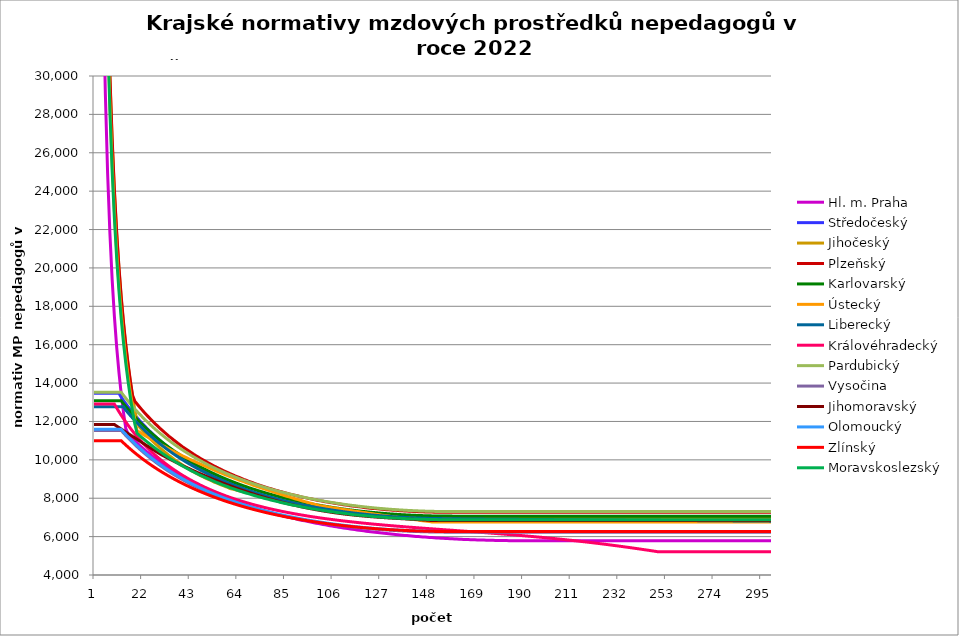
| Category | Hl. m. Praha | Středočeský | Jihočeský | Plzeňský | Karlovarský  | Ústecký   | Liberecký | Královéhradecký | Pardubický | Vysočina | Jihomoravský | Olomoucký | Zlínský | Moravskoslezský |
|---|---|---|---|---|---|---|---|---|---|---|---|---|---|---|
| 0 | 174132.515 | 13474.444 | 239423.04 | 240610 | 13079.309 | 216556.8 | 12770.985 | 12903.738 | 13519.044 | 11532.848 | 11842.105 | 11593.122 | 10994.974 | 225600 |
| 1 | 87334.154 | 13474.444 | 119711.52 | 120305 | 13079.309 | 111809.2 | 12770.985 | 12903.738 | 13519.044 | 11532.848 | 11842.105 | 11593.122 | 10994.974 | 112800 |
| 2 | 58163.115 | 13474.444 | 79807.68 | 80203.333 | 13079.309 | 75358.578 | 12770.985 | 12903.738 | 13519.044 | 11532.848 | 11842.105 | 11593.122 | 10994.974 | 75200 |
| 3 | 43667.077 | 13474.444 | 59855.76 | 60152.5 | 13079.309 | 56831.191 | 12770.985 | 12903.738 | 13519.044 | 11532.848 | 11842.105 | 11593.122 | 10994.974 | 56400 |
| 4 | 34912.177 | 13474.444 | 47884.608 | 48122 | 13079.309 | 45616.166 | 12770.985 | 12903.738 | 13519.044 | 11532.848 | 11842.105 | 11593.122 | 10994.974 | 45120 |
| 5 | 29111.385 | 13474.444 | 39903.84 | 40101.667 | 13079.309 | 38097.946 | 12770.985 | 12903.738 | 13519.044 | 11532.848 | 11842.105 | 11593.122 | 10994.974 | 37600 |
| 6 | 24941.652 | 13474.444 | 34203.291 | 34372.857 | 13079.309 | 32707.298 | 12770.985 | 12903.738 | 13519.044 | 11532.848 | 11842.105 | 11593.122 | 10994.974 | 32228.571 |
| 7 | 21833.538 | 13474.444 | 29927.88 | 30076.25 | 13079.309 | 28653.051 | 12770.985 | 12903.738 | 13519.044 | 11532.848 | 11842.105 | 11593.122 | 10994.974 | 28200 |
| 8 | 19400.957 | 13474.444 | 26602.56 | 26734.444 | 13079.309 | 25493.049 | 12770.985 | 12903.738 | 13519.044 | 11532.848 | 11842.105 | 11593.122 | 10994.974 | 25066.667 |
| 9 | 17466.831 | 13474.444 | 23942.304 | 24061 | 13079.309 | 22960.815 | 12770.985 | 12903.738 | 13519.044 | 11532.848 | 11842.105 | 11593.122 | 10994.974 | 22560 |
| 10 | 15874.497 | 13474.444 | 21765.731 | 21873.636 | 13079.309 | 20886.183 | 12770.985 | 12704.407 | 13519.044 | 11532.848 | 11757.269 | 11593.122 | 10994.974 | 20509.091 |
| 11 | 14555.692 | 13474.444 | 19951.92 | 20050.833 | 13079.309 | 19155.391 | 12770.985 | 12511.141 | 13519.044 | 11532.848 | 11683.417 | 11593.122 | 10994.974 | 18800 |
| 12 | 13432.844 | 13259.201 | 18417.157 | 18508.462 | 13079.425 | 17689.501 | 12770.985 | 12323.667 | 13519.044 | 11532.848 | 11605.657 | 11593.122 | 10994.974 | 17353.846 |
| 13 | 12476.308 | 13092.983 | 17101.646 | 17186.429 | 12929.335 | 16432.021 | 12770.985 | 12147.003 | 13364.028 | 11400.57 | 11528.926 | 11456.732 | 10882.85 | 16114.286 |
| 14 | 11642.166 | 12931.988 | 15961.536 | 16040.667 | 12783.648 | 15341.454 | 12591.093 | 11975.332 | 13213.443 | 11272.173 | 11453.202 | 11328.393 | 10773.736 | 15040 |
| 15 | 11357.983 | 12775.987 | 14963.94 | 15038.125 | 12642.182 | 14386.636 | 12450.554 | 11808.446 | 13067.22 | 11147.498 | 11373.828 | 11202.897 | 10667.521 | 14100 |
| 16 | 11232.133 | 12624.76 | 14083.708 | 14153.529 | 12504.766 | 13543.706 | 12314.064 | 11651 | 12925.184 | 11026.394 | 11300.122 | 11080.152 | 10564.099 | 13270.588 |
| 17 | 11113.391 | 12478.103 | 13301.28 | 13367.222 | 12371.238 | 12794.086 | 12181.461 | 11497.697 | 12787.167 | 10908.307 | 11222.848 | 10964.637 | 10463.367 | 12533.333 |
| 18 | 10997.133 | 12335.822 | 12601.213 | 13058.887 | 12241.445 | 12123.094 | 12052.591 | 11352.984 | 12653.011 | 10793.934 | 11146.624 | 10847.03 | 10365.23 | 11873.684 |
| 19 | 10883.282 | 12197.735 | 11971.152 | 12912.88 | 12115.243 | 11518.975 | 11927.307 | 11211.868 | 12522.565 | 10682.726 | 11067.037 | 10736.301 | 10269.595 | 11386.578 |
| 20 | 10771.765 | 12063.67 | 11724.949 | 12770.102 | 11992.493 | 11445.92 | 11805.471 | 11074.218 | 12395.688 | 10574.563 | 10992.908 | 10627.809 | 10176.376 | 11280.023 |
| 21 | 10666.516 | 11933.463 | 11586.18 | 12630.446 | 11873.064 | 11373.782 | 11686.952 | 10944.188 | 12272.245 | 10469.328 | 10915.493 | 10521.489 | 10085.489 | 11176.195 |
| 22 | 10563.305 | 11806.961 | 11452.134 | 12493.812 | 11756.834 | 11302.547 | 11571.625 | 10817.176 | 12152.107 | 10366.54 | 10839.161 | 10421.403 | 9996.854 | 11075.002 |
| 23 | 10458.217 | 11684.017 | 11322.598 | 12365.396 | 11643.684 | 11232.199 | 11459.372 | 10697.169 | 12035.153 | 10266.847 | 10763.889 | 10319.152 | 9910.395 | 10976.35 |
| 24 | 10358.978 | 11564.493 | 11197.371 | 12239.593 | 11533.503 | 11162.722 | 11350.08 | 10575.794 | 11921.267 | 10169.771 | 10689.655 | 10222.862 | 9826.041 | 10880.154 |
| 25 | 10261.605 | 11448.258 | 11076.266 | 12116.324 | 11426.183 | 11094.098 | 11243.643 | 10464.97 | 11810.338 | 10075.218 | 10616.438 | 10128.351 | 9743.722 | 10786.331 |
| 26 | 10169.688 | 11335.187 | 10959.105 | 11995.513 | 11321.623 | 11026.314 | 11139.959 | 10352.61 | 11702.264 | 9982.753 | 10540.234 | 10035.573 | 9663.372 | 10694.802 |
| 27 | 10075.825 | 11225.163 | 10845.721 | 11877.088 | 11219.727 | 10959.352 | 11038.93 | 10246.391 | 11596.942 | 9893.328 | 10465.116 | 9944.478 | 9584.927 | 10605.491 |
| 28 | 9983.679 | 11118.074 | 10735.957 | 11765.77 | 11120.403 | 10893.199 | 10940.465 | 10142.329 | 11494.279 | 9805.49 | 10391.061 | 9855.022 | 9508.328 | 10518.326 |
| 29 | 9896.653 | 11013.812 | 10629.666 | 11651.816 | 11023.563 | 10827.84 | 10844.475 | 10043.966 | 11394.183 | 9720.182 | 10314.233 | 9770.792 | 9433.517 | 10433.238 |
| 30 | 9811.13 | 10912.276 | 10526.706 | 11544.662 | 10929.124 | 10763.26 | 10750.876 | 9947.492 | 11296.568 | 9636.99 | 10249.816 | 9684.42 | 9360.437 | 10350.162 |
| 31 | 9727.073 | 10813.371 | 10426.946 | 11439.461 | 10837.004 | 10699.447 | 10659.589 | 9852.854 | 11201.352 | 9555.843 | 10186.199 | 9603.068 | 9289.037 | 10269.034 |
| 32 | 9644.444 | 10717.002 | 10330.261 | 11340.613 | 10747.129 | 10636.385 | 10570.537 | 9763.408 | 11108.455 | 9476.363 | 10123.367 | 9523.071 | 9219.264 | 10189.794 |
| 33 | 9566.431 | 10623.085 | 10236.533 | 11239.081 | 10659.426 | 10574.062 | 10483.647 | 9675.571 | 11017.803 | 9399.113 | 10061.305 | 9447.79 | 9151.071 | 10112.384 |
| 34 | 9486.497 | 10531.533 | 10145.649 | 11143.651 | 10573.823 | 10512.466 | 10398.849 | 9589.3 | 10929.322 | 9323.716 | 10000 | 9370.349 | 9084.411 | 10036.748 |
| 35 | 9411.008 | 10442.269 | 10057.504 | 11045.601 | 10490.256 | 10451.583 | 10316.076 | 9507.786 | 10842.945 | 9250.112 | 9939.437 | 9297.454 | 9019.238 | 9962.834 |
| 36 | 9333.64 | 10355.216 | 9971.998 | 10953.414 | 10408.66 | 10391.401 | 10235.265 | 9427.647 | 10758.606 | 9177.954 | 9879.603 | 9225.684 | 8955.511 | 9890.59 |
| 37 | 9260.555 | 10270.301 | 9889.034 | 10862.754 | 10328.974 | 10331.908 | 10156.354 | 9348.847 | 10676.241 | 9107.776 | 9820.486 | 9155.014 | 8893.186 | 9819.967 |
| 38 | 9191.58 | 10187.455 | 9808.523 | 10777.604 | 10251.139 | 10273.093 | 10079.285 | 9271.353 | 10595.789 | 9038.946 | 9762.071 | 9085.418 | 8832.226 | 9750.919 |
| 39 | 9120.694 | 10106.611 | 9730.379 | 10689.819 | 10175.1 | 10214.943 | 10004.002 | 9198.158 | 10517.194 | 8971.987 | 9704.348 | 9016.872 | 8772.59 | 9683.401 |
| 40 | 9050.893 | 10027.707 | 9654.52 | 10607.348 | 10100.803 | 10157.448 | 9930.45 | 9129.089 | 10440.398 | 8906.563 | 9647.303 | 8952.4 | 8714.244 | 9617.369 |
| 41 | 8984.995 | 9950.681 | 9580.868 | 10526.139 | 10028.196 | 10100.597 | 9858.58 | 9058.115 | 10365.35 | 8842.357 | 9590.925 | 8888.844 | 8657.151 | 9552.781 |
| 42 | 8920.05 | 9875.476 | 9509.349 | 10446.165 | 9957.23 | 10044.378 | 9788.34 | 8991.125 | 10291.998 | 8779.873 | 9538.462 | 8823.221 | 8601.277 | 9489.598 |
| 43 | 8853.275 | 9802.036 | 9439.894 | 10367.397 | 9887.857 | 9988.782 | 9719.684 | 8925.12 | 10220.294 | 8718.793 | 9483.345 | 8764.4 | 8546.591 | 9427.781 |
| 44 | 8790.214 | 9730.307 | 9372.436 | 10289.808 | 9820.033 | 9933.798 | 9652.567 | 8862.884 | 10150.189 | 8658.816 | 9428.861 | 8703.476 | 8493.059 | 9367.293 |
| 45 | 8730.729 | 9660.239 | 9306.91 | 10216.985 | 9753.712 | 9879.416 | 9586.944 | 8801.511 | 10081.638 | 8600.686 | 9375 | 8643.393 | 8440.653 | 9308.098 |
| 46 | 8669.395 | 9591.782 | 9243.257 | 10145.186 | 9688.854 | 9825.626 | 9522.773 | 8740.982 | 10014.6 | 8543.331 | 9321.751 | 8586.937 | 8389.342 | 9250.163 |
| 47 | 8611.529 | 9524.889 | 9181.418 | 10074.389 | 9625.417 | 9772.419 | 9460.015 | 8681.279 | 9949.03 | 8487.236 | 9269.103 | 8531.213 | 8339.1 | 9193.454 |
| 48 | 8551.853 | 9459.517 | 9121.337 | 10004.574 | 9563.364 | 9719.785 | 9398.63 | 8625.046 | 9884.89 | 8432.613 | 9220.093 | 8476.209 | 8289.897 | 9137.939 |
| 49 | 8495.54 | 9395.62 | 9062.963 | 9935.719 | 9502.656 | 9667.714 | 9338.581 | 8569.537 | 9822.141 | 8379.175 | 9168.584 | 8421.909 | 8241.71 | 9083.588 |
| 50 | 8439.964 | 9333.158 | 9006.244 | 9867.806 | 9443.257 | 9616.199 | 9279.832 | 8514.738 | 9760.746 | 8326.651 | 9117.647 | 8368.3 | 8194.511 | 9030.372 |
| 51 | 8385.111 | 9272.09 | 8951.134 | 9804.143 | 9385.134 | 9565.23 | 9222.349 | 8463.196 | 9700.668 | 8275.494 | 9067.273 | 8318.001 | 8148.278 | 8978.261 |
| 52 | 8330.966 | 9212.379 | 8897.585 | 9741.296 | 9328.252 | 9514.798 | 9166.098 | 8412.274 | 9641.874 | 8225.196 | 9020.369 | 8268.302 | 8102.986 | 8927.229 |
| 53 | 8279.93 | 9153.987 | 8845.555 | 9679.249 | 9272.58 | 9464.895 | 9111.048 | 8361.962 | 9584.33 | 8175.97 | 8971.061 | 8219.193 | 8058.612 | 8877.248 |
| 54 | 8227.13 | 9096.878 | 8795 | 9617.988 | 9218.086 | 9415.513 | 9057.167 | 8312.247 | 9528.005 | 8128.246 | 8922.29 | 8170.665 | 8015.136 | 8828.294 |
| 55 | 8177.355 | 9041.02 | 8745.882 | 9560.662 | 9164.742 | 9366.644 | 9004.427 | 8265.563 | 9472.867 | 8081.303 | 8876.869 | 8122.706 | 7972.535 | 8780.342 |
| 56 | 8128.179 | 8986.378 | 8698.161 | 9500.888 | 9112.517 | 9318.279 | 8952.797 | 8219.4 | 9418.886 | 8035.123 | 8829.114 | 8075.307 | 7930.79 | 8733.368 |
| 57 | 8079.59 | 8932.922 | 8651.801 | 9444.946 | 9061.385 | 9270.411 | 8902.251 | 8173.75 | 9366.035 | 7989.91 | 8781.87 | 8030.91 | 7889.88 | 8687.348 |
| 58 | 8031.579 | 8880.62 | 8606.767 | 9389.659 | 9011.319 | 9223.032 | 8852.762 | 8128.605 | 9314.286 | 7945.642 | 8737.864 | 7986.999 | 7849.787 | 8642.261 |
| 59 | 7986.382 | 8829.444 | 8563.026 | 9335.015 | 8962.293 | 9176.136 | 8804.304 | 8086.293 | 9263.611 | 7902.511 | 8691.589 | 7943.565 | 7810.492 | 8598.085 |
| 60 | 7939.469 | 8779.365 | 8508.044 | 9281.003 | 8914.282 | 9129.713 | 8756.852 | 8044.419 | 9213.986 | 7860.275 | 8648.481 | 7900.601 | 7771.978 | 8554.8 |
| 61 | 7895.299 | 8730.356 | 8476.848 | 9230.563 | 8867.261 | 9083.758 | 8710.383 | 8005.268 | 9165.385 | 7818.7 | 8603.145 | 7858.099 | 7734.226 | 8512.385 |
| 62 | 7851.618 | 8682.39 | 8446.115 | 9177.75 | 8821.209 | 9038.264 | 8664.874 | 7964.227 | 9117.784 | 7778.192 | 8560.908 | 7818.376 | 7697.221 | 8470.821 |
| 63 | 7808.418 | 8635.443 | 8415.838 | 9128.422 | 8776.102 | 8993.223 | 8620.301 | 7925.85 | 9071.161 | 7738.309 | 8516.484 | 7779.053 | 7660.946 | 8430.09 |
| 64 | 7765.691 | 8589.49 | 8386.009 | 9079.623 | 8731.919 | 8948.628 | 8576.645 | 7887.842 | 9025.492 | 7699.45 | 8475.091 | 7737.846 | 7625.385 | 8390.173 |
| 65 | 7723.429 | 8544.506 | 8356.62 | 9031.342 | 8688.639 | 8904.474 | 8533.882 | 7850.197 | 8980.757 | 7661.386 | 8434.099 | 7699.327 | 7590.524 | 8351.052 |
| 66 | 7683.703 | 8500.471 | 8327.666 | 8983.572 | 8646.242 | 8860.753 | 8491.995 | 7815.092 | 8936.935 | 7624.101 | 8393.502 | 7663.422 | 7556.348 | 8312.711 |
| 67 | 7642.326 | 8457.36 | 8299.138 | 8939.071 | 8604.708 | 8817.459 | 8450.963 | 7780.301 | 8894.004 | 7587.176 | 8353.293 | 7625.638 | 7522.843 | 8275.134 |
| 68 | 7603.429 | 8415.154 | 8271.031 | 8895.009 | 8564.018 | 8774.587 | 8410.767 | 7745.817 | 8851.946 | 7551.399 | 8313.468 | 7590.416 | 7489.995 | 8238.303 |
| 69 | 7564.925 | 8373.832 | 8243.338 | 8851.38 | 8524.155 | 8732.129 | 8371.389 | 7711.638 | 8810.742 | 7516.349 | 8274.021 | 7555.517 | 7457.79 | 8202.205 |
| 70 | 7526.81 | 8333.373 | 8216.052 | 8808.176 | 8485.099 | 8690.08 | 8332.812 | 7677.759 | 8770.374 | 7481.818 | 8234.947 | 7520.938 | 7426.216 | 8166.823 |
| 71 | 7491.053 | 8293.76 | 8189.167 | 8765.392 | 8446.835 | 8648.435 | 8295.018 | 7646.267 | 8730.823 | 7448.18 | 8196.24 | 7486.674 | 7395.26 | 8132.144 |
| 72 | 7453.676 | 8254.973 | 8162.677 | 8723.021 | 8409.346 | 8607.186 | 8257.992 | 7615.033 | 8692.074 | 7414.842 | 8160.281 | 7452.721 | 7364.911 | 8098.154 |
| 73 | 7418.61 | 8216.994 | 8136.576 | 8683.669 | 8372.615 | 8566.329 | 8221.717 | 7584.052 | 8654.108 | 7382.559 | 8122.271 | 7421.169 | 7335.156 | 8064.839 |
| 74 | 7381.951 | 8179.807 | 8110.858 | 8644.671 | 8336.628 | 8525.858 | 8186.177 | 7555.363 | 8616.911 | 7350.93 | 8086.957 | 7387.806 | 7305.984 | 8032.186 |
| 75 | 7347.554 | 8143.393 | 8085.518 | 8606.021 | 8301.369 | 8485.768 | 8151.358 | 7524.865 | 8580.466 | 7319.942 | 8051.948 | 7356.799 | 7277.384 | 8000.182 |
| 76 | 7313.476 | 8107.739 | 8060.55 | 8567.715 | 8266.823 | 8446.053 | 8117.246 | 7496.622 | 8544.76 | 7289.399 | 8014.938 | 7326.052 | 7249.345 | 7968.814 |
| 77 | 7279.713 | 8072.827 | 8035.948 | 8529.749 | 8232.978 | 8406.708 | 8083.826 | 7468.59 | 8509.776 | 7259.476 | 7980.549 | 7295.56 | 7221.858 | 7938.072 |
| 78 | 7248.11 | 8038.642 | 8011.708 | 8494.616 | 8199.818 | 8367.728 | 8051.085 | 7440.766 | 8475.501 | 7230.341 | 7948.718 | 7267.33 | 7194.911 | 7907.943 |
| 79 | 7214.947 | 8005.17 | 7987.824 | 8457.293 | 8167.331 | 8329.108 | 8019.01 | 7415.115 | 8441.922 | 7201.619 | 7914.894 | 7239.317 | 7168.496 | 7878.415 |
| 80 | 7183.903 | 7972.397 | 7964.291 | 8422.754 | 8135.504 | 8290.842 | 7987.588 | 7389.641 | 8409.025 | 7173.66 | 7881.356 | 7209.542 | 7142.602 | 7849.479 |
| 81 | 7153.125 | 7940.309 | 7941.104 | 8388.495 | 8104.324 | 8252.927 | 7956.806 | 7364.34 | 8376.797 | 7146.094 | 7850.31 | 7181.972 | 7117.22 | 7821.124 |
| 82 | 7122.61 | 7908.893 | 7918.259 | 8356.932 | 8073.78 | 8215.357 | 7926.653 | 7339.213 | 8345.226 | 7119.091 | 7819.507 | 7154.612 | 7092.343 | 7793.338 |
| 83 | 7092.354 | 7878.135 | 7895.75 | 8323.206 | 8043.86 | 8178.127 | 7897.117 | 7314.256 | 8314.3 | 7092.64 | 7786.771 | 7129.393 | 7067.96 | 7766.113 |
| 84 | 7062.354 | 7848.024 | 7873.573 | 8292.131 | 8014.552 | 8141.233 | 7868.187 | 7289.468 | 8284.007 | 7066.905 | 7758.621 | 7102.431 | 7044.063 | 7739.439 |
| 85 | 7032.607 | 7818.548 | 7851.723 | 8258.924 | 7985.846 | 8104.671 | 7839.852 | 7266.736 | 8254.336 | 7041.7 | 7728.532 | 7077.577 | 7020.645 | 7713.306 |
| 86 | 7004.837 | 7789.694 | 7830.197 | 8228.327 | 7957.731 | 8068.435 | 7812.101 | 7244.145 | 8225.275 | 7016.845 | 7698.675 | 7052.897 | 6997.697 | 7687.705 |
| 87 | 6977.286 | 7761.451 | 7808.989 | 8197.956 | 7930.197 | 8032.522 | 7784.925 | 7221.694 | 8196.816 | 6992.504 | 7671.158 | 7028.388 | 6975.213 | 7662.627 |
| 88 | 6949.951 | 7733.808 | 7788.096 | 8170.119 | 7903.234 | 7996.928 | 7758.313 | 7199.382 | 8168.946 | 6968.668 | 7643.836 | 7004.049 | 6953.183 | 7638.064 |
| 89 | 6922.829 | 7706.756 | 7767.513 | 8140.175 | 7876.831 | 7961.647 | 7732.256 | 7179.05 | 8141.655 | 6945.497 | 7616.708 | 6981.731 | 6931.601 | 7614.008 |
| 90 | 6895.918 | 7680.282 | 7747.236 | 8112.728 | 7850.98 | 7926.676 | 7706.744 | 7157 | 8114.935 | 6922.811 | 7589.771 | 6957.714 | 6910.461 | 7590.449 |
| 91 | 6869.216 | 7654.379 | 7727.262 | 8085.466 | 7825.672 | 7892.012 | 7681.768 | 7136.907 | 8088.776 | 6900.438 | 7563.025 | 6935.69 | 6889.754 | 7567.382 |
| 92 | 6844.369 | 7629.035 | 7707.587 | 8058.387 | 7800.897 | 7857.649 | 7657.32 | 7116.925 | 8063.169 | 6878.538 | 7538.503 | 6913.805 | 6869.475 | 7544.797 |
| 93 | 6819.702 | 7604.241 | 7688.206 | 8031.488 | 7776.648 | 7823.584 | 7633.39 | 7097.056 | 8038.104 | 6857.102 | 7514.14 | 6892.058 | 6849.617 | 7522.688 |
| 94 | 6793.585 | 7579.989 | 7669.116 | 8004.769 | 7752.915 | 7789.813 | 7609.972 | 7077.297 | 8013.573 | 6836.286 | 7489.933 | 6870.447 | 6830.174 | 7501.047 |
| 95 | 6769.282 | 7556.269 | 7650.314 | 7980.431 | 7729.691 | 7756.332 | 7587.056 | 7059.429 | 7989.569 | 6815.757 | 7465.882 | 6850.756 | 6811.139 | 7479.868 |
| 96 | 6746.755 | 7533.073 | 7631.796 | 7956.241 | 7706.968 | 7723.138 | 7564.635 | 7039.879 | 7966.081 | 6795.832 | 7443.97 | 6831.177 | 6792.508 | 7459.143 |
| 97 | 6722.785 | 7510.393 | 7613.558 | 7932.198 | 7684.738 | 7690.227 | 7542.702 | 7022.2 | 7943.104 | 6776.023 | 7422.187 | 6809.946 | 6774.273 | 7438.867 |
| 98 | 6698.985 | 7488.22 | 7595.598 | 7908.299 | 7662.994 | 7657.595 | 7521.248 | 7004.609 | 7920.629 | 6756.962 | 7398.568 | 6790.599 | 6756.43 | 7419.032 |
| 99 | 6676.923 | 7466.548 | 7577.911 | 7884.544 | 7641.729 | 7625.239 | 7500.268 | 6987.106 | 7898.649 | 6738.166 | 7379 | 6773.107 | 6738.973 | 7399.633 |
| 100 | 6655.006 | 7445.368 | 7560.495 | 7860.931 | 7620.936 | 7605.957 | 7479.754 | 6969.691 | 7877.157 | 6719.787 | 7357.595 | 6753.969 | 6721.897 | 7380.663 |
| 101 | 6633.232 | 7424.673 | 7543.346 | 7839.587 | 7600.608 | 7586.771 | 7459.699 | 6954.091 | 7856.145 | 6701.976 | 7338.243 | 6736.664 | 6705.197 | 7362.117 |
| 102 | 6611.6 | 7404.456 | 7526.462 | 7818.359 | 7580.738 | 7567.682 | 7440.097 | 6936.839 | 7835.607 | 6684.414 | 7318.993 | 6717.731 | 6688.867 | 7343.989 |
| 103 | 6590.109 | 7384.71 | 7509.839 | 7797.245 | 7561.32 | 7548.689 | 7420.941 | 6921.386 | 7815.537 | 6667.253 | 7299.843 | 6700.612 | 6672.904 | 7326.274 |
| 104 | 6568.757 | 7365.428 | 7493.475 | 7776.246 | 7542.349 | 7529.791 | 7402.226 | 6906.001 | 7795.928 | 6650.639 | 7280.793 | 6685.278 | 6657.301 | 7308.966 |
| 105 | 6549.054 | 7346.605 | 7477.365 | 7757.442 | 7523.818 | 7510.988 | 7383.946 | 6890.685 | 7776.774 | 6634.261 | 7263.733 | 6668.324 | 6642.056 | 7292.06 |
| 106 | 6529.469 | 7328.233 | 7461.509 | 7736.656 | 7505.721 | 7492.278 | 7366.095 | 6875.436 | 7758.068 | 6618.267 | 7246.753 | 6651.455 | 6627.163 | 7275.551 |
| 107 | 6510 | 7310.307 | 7445.902 | 7718.043 | 7488.053 | 7473.661 | 7348.667 | 6860.255 | 7739.806 | 6602.652 | 7229.852 | 6636.345 | 6612.618 | 7259.435 |
| 108 | 6490.647 | 7292.821 | 7430.543 | 7699.52 | 7470.808 | 7455.136 | 7331.657 | 6845.141 | 7721.981 | 6587.413 | 7214.895 | 6621.304 | 6598.417 | 7243.706 |
| 109 | 6471.409 | 7275.769 | 7415.428 | 7681.085 | 7453.981 | 7436.703 | 7315.06 | 6831.762 | 7704.589 | 6572.692 | 7198.142 | 6606.332 | 6584.556 | 7228.36 |
| 110 | 6452.285 | 7259.146 | 7400.555 | 7662.739 | 7437.567 | 7418.361 | 7298.87 | 6816.772 | 7687.623 | 6558.187 | 7183.316 | 6591.426 | 6571.031 | 7213.392 |
| 111 | 6434.731 | 7242.946 | 7385.921 | 7646.504 | 7421.561 | 7400.109 | 7283.083 | 6803.504 | 7671.079 | 6544.043 | 7168.551 | 6578.234 | 6557.838 | 7198.799 |
| 112 | 6415.823 | 7227.165 | 7371.524 | 7628.322 | 7405.958 | 7381.947 | 7267.694 | 6790.287 | 7654.951 | 6530.255 | 7155.681 | 6563.455 | 6544.974 | 7184.576 |
| 113 | 6398.467 | 7211.796 | 7357.362 | 7612.233 | 7390.754 | 7363.874 | 7252.699 | 6777.121 | 7639.236 | 6516.968 | 7141.029 | 6550.374 | 6532.436 | 7170.719 |
| 114 | 6381.205 | 7196.837 | 7343.432 | 7596.212 | 7377.787 | 7345.889 | 7238.092 | 6764.006 | 7623.927 | 6503.734 | 7128.258 | 6537.345 | 6520.218 | 7157.224 |
| 115 | 6364.036 | 7182.28 | 7329.731 | 7580.257 | 7361.523 | 7327.991 | 7223.87 | 6750.942 | 7609.022 | 6491.139 | 7115.532 | 6524.367 | 6508.319 | 7144.088 |
| 116 | 6346.959 | 7168.123 | 7316.258 | 7564.37 | 7347.487 | 7310.181 | 7210.028 | 6737.928 | 7594.515 | 6478.738 | 7102.851 | 6511.441 | 6496.735 | 7131.306 |
| 117 | 6331.385 | 7154.361 | 7303.011 | 7550.523 | 7333.834 | 7292.457 | 7196.563 | 6724.964 | 7580.402 | 6466.674 | 7092.018 | 6500.173 | 6485.463 | 7118.875 |
| 118 | 6314.483 | 7140.99 | 7289.986 | 7536.727 | 7320.557 | 7274.819 | 7183.47 | 6713.661 | 7566.679 | 6454.944 | 7081.218 | 6487.343 | 6474.5 | 7106.792 |
| 119 | 6299.068 | 7128.005 | 7277.182 | 7522.981 | 7307.654 | 7257.265 | 7170.746 | 6700.791 | 7553.342 | 6443.689 | 7070.451 | 6476.158 | 6463.843 | 7095.054 |
| 120 | 6283.728 | 7115.402 | 7264.597 | 7509.285 | 7295.121 | 7239.797 | 7158.386 | 6689.569 | 7540.388 | 6432.617 | 7059.717 | 6465.011 | 6453.489 | 7083.656 |
| 121 | 6268.463 | 7103.179 | 7252.229 | 7495.639 | 7282.955 | 7222.412 | 7146.389 | 6678.385 | 7527.812 | 6421.869 | 7049.015 | 6453.903 | 6443.436 | 7072.597 |
| 122 | 6253.272 | 7091.33 | 7240.076 | 7482.042 | 7271.151 | 7205.11 | 7134.749 | 6667.239 | 7515.612 | 6411.442 | 7040.121 | 6444.412 | 6433.68 | 7061.873 |
| 123 | 6239.525 | 7079.853 | 7228.136 | 7470.427 | 7259.707 | 7187.892 | 7123.464 | 6654.545 | 7503.783 | 6401.332 | 7031.25 | 6433.374 | 6424.219 | 7051.481 |
| 124 | 6224.474 | 7068.744 | 7216.406 | 7458.848 | 7248.619 | 7170.755 | 7112.53 | 6643.478 | 7492.322 | 6391.539 | 7020.634 | 6423.943 | 6415.051 | 7041.418 |
| 125 | 6210.853 | 7058.001 | 7204.886 | 7447.305 | 7237.884 | 7153.7 | 7101.945 | 6632.448 | 7481.227 | 6382.199 | 7013.575 | 6414.54 | 6406.173 | 7031.682 |
| 126 | 6197.293 | 7047.618 | 7193.573 | 7435.797 | 7227.5 | 7136.726 | 7091.706 | 6623.022 | 7470.493 | 6372.886 | 7004.77 | 6405.164 | 6397.584 | 7022.271 |
| 127 | 6183.791 | 7037.595 | 7182.466 | 7424.325 | 7217.463 | 7119.832 | 7081.809 | 6612.06 | 7460.119 | 6364.022 | 6995.988 | 6395.816 | 6389.28 | 7013.181 |
| 128 | 6170.348 | 7027.927 | 7171.562 | 7414.792 | 7207.77 | 7103.018 | 7072.252 | 6601.133 | 7450.1 | 6355.603 | 6988.978 | 6388.047 | 6381.26 | 7004.41 |
| 129 | 6156.963 | 7018.612 | 7160.861 | 7403.385 | 7198.42 | 7086.283 | 7063.033 | 6590.243 | 7440.435 | 6347.345 | 6980.235 | 6380.296 | 6373.521 | 6995.956 |
| 130 | 6144.966 | 7009.647 | 7150.36 | 7393.905 | 7189.409 | 7069.627 | 7054.148 | 6580.937 | 7431.121 | 6339.389 | 6973.257 | 6371.02 | 6366.062 | 6987.817 |
| 131 | 6131.692 | 7001.03 | 7140.057 | 7384.45 | 7180.735 | 7053.048 | 7045.595 | 6570.113 | 7422.156 | 6331.73 | 6966.292 | 6363.311 | 6358.881 | 6979.991 |
| 132 | 6119.793 | 6992.758 | 7129.952 | 7376.903 | 7172.395 | 7036.548 | 7037.372 | 6560.863 | 7413.536 | 6324.228 | 6959.341 | 6357.157 | 6351.976 | 6972.475 |
| 133 | 6107.941 | 6984.829 | 7120.043 | 7367.492 | 7164.388 | 7020.124 | 7029.478 | 6550.105 | 7405.259 | 6317.16 | 6952.405 | 6349.481 | 6345.345 | 6965.268 |
| 134 | 6096.134 | 6977.241 | 7110.328 | 7359.98 | 7156.711 | 7003.777 | 7021.908 | 6540.912 | 7397.324 | 6310.521 | 6945.482 | 6343.353 | 6338.986 | 6958.367 |
| 135 | 6084.373 | 6969.99 | 7100.805 | 7350.611 | 7149.362 | 6987.506 | 7014.663 | 6531.745 | 7389.728 | 6304.035 | 6938.572 | 6335.711 | 6332.898 | 6951.771 |
| 136 | 6073.957 | 6963.076 | 7091.474 | 7343.133 | 7142.339 | 6971.311 | 7007.739 | 6522.603 | 7382.469 | 6297.837 | 6931.677 | 6329.61 | 6327.08 | 6945.479 |
| 137 | 6062.281 | 6956.497 | 7082.332 | 7335.671 | 7135.64 | 6955.19 | 7001.134 | 6511.97 | 7375.545 | 6291.926 | 6926.514 | 6323.521 | 6321.53 | 6939.489 |
| 138 | 6051.94 | 6950.25 | 7073.379 | 7330.084 | 7129.264 | 6939.144 | 6994.848 | 6502.884 | 7368.954 | 6286.3 | 6919.643 | 6318.962 | 6316.246 | 6933.798 |
| 139 | 6041.635 | 6944.333 | 7064.614 | 7322.648 | 7123.208 | 6923.171 | 6988.878 | 6493.823 | 7362.695 | 6281.095 | 6912.785 | 6312.893 | 6311.227 | 6928.406 |
| 140 | 6031.364 | 6938.746 | 7056.034 | 7317.081 | 7117.472 | 6907.272 | 6983.222 | 6484.787 | 7356.766 | 6275.898 | 6905.941 | 6308.349 | 6306.473 | 6923.312 |
| 141 | 6021.129 | 6933.486 | 7047.638 | 7311.522 | 7112.053 | 6891.446 | 6977.88 | 6475.776 | 7351.165 | 6271.119 | 6899.11 | 6303.812 | 6301.981 | 6918.514 |
| 142 | 6010.928 | 6928.552 | 7039.426 | 7305.972 | 7106.951 | 6875.692 | 6972.85 | 6466.79 | 7345.891 | 6266.62 | 6892.292 | 6299.281 | 6297.751 | 6914.01 |
| 143 | 6002.03 | 6923.943 | 7031.396 | 7300.43 | 7102.163 | 6860.01 | 6968.13 | 6457.829 | 7340.943 | 6262.4 | 6885.489 | 6294.757 | 6293.782 | 6909.8 |
| 144 | 5991.894 | 6919.657 | 7023.547 | 7294.896 | 7097.689 | 6844.399 | 6963.719 | 6448.893 | 7336.318 | 6258.457 | 6878.698 | 6290.239 | 6290.072 | 6905.883 |
| 145 | 5983.052 | 6915.694 | 7015.877 | 7291.212 | 7093.528 | 6828.86 | 6959.616 | 6439.982 | 7332.017 | 6254.79 | 6870.229 | 6287.231 | 6286.621 | 6902.257 |
| 146 | 5974.237 | 6912.051 | 7008.387 | 7287.532 | 7089.678 | 6813.39 | 6955.821 | 6431.095 | 7328.037 | 6251.399 | 6863.469 | 6282.724 | 6283.428 | 6898.922 |
| 147 | 5965.448 | 6908.729 | 7001.073 | 7283.855 | 7086.138 | 6797.991 | 6952.331 | 6422.232 | 7324.379 | 6248.147 | 6855.037 | 6279.723 | 6280.493 | 6895.877 |
| 148 | 5957.935 | 6905.726 | 6993.937 | 7280.182 | 7082.907 | 6782.661 | 6949.146 | 6413.394 | 7321.039 | 6245.439 | 6846.626 | 6276.725 | 6277.813 | 6893.121 |
| 149 | 5949.193 | 6903.041 | 6986.976 | 7276.512 | 7079.986 | 6767.4 | 6946.266 | 6406.048 | 7318.019 | 6242.869 | 6838.235 | 6275.227 | 6275.39 | 6890.654 |
| 150 | 5941.721 | 6900.674 | 6980.189 | 7272.846 | 7077.372 | 6767.4 | 6943.689 | 6397.255 | 7315.318 | 6240.707 | 6838.235 | 6272.233 | 6273.222 | 6888.474 |
| 151 | 5933.027 | 6898.623 | 6973.575 | 7271.015 | 7075.065 | 6767.4 | 6941.414 | 6388.485 | 7312.933 | 6238.546 | 6838.235 | 6270.737 | 6271.308 | 6886.581 |
| 152 | 5925.595 | 6896.889 | 6967.135 | 7269.184 | 7073.064 | 6767.4 | 6939.442 | 6379.74 | 7310.865 | 6236.656 | 6838.235 | 6269.242 | 6269.649 | 6884.976 |
| 153 | 5918.182 | 6895.471 | 6960.866 | 7267.355 | 7071.37 | 6767.4 | 6937.772 | 6371.018 | 7309.114 | 6235.172 | 6838.235 | 6267.747 | 6268.243 | 6883.656 |
| 154 | 5910.787 | 6894.369 | 6954.767 | 7265.526 | 7069.981 | 6767.4 | 6936.403 | 6362.321 | 7307.679 | 6234.093 | 6838.235 | 6266.254 | 6267.091 | 6882.623 |
| 155 | 5904.639 | 6893.582 | 6948.839 | 7265.526 | 7068.898 | 6767.4 | 6935.335 | 6353.647 | 7306.559 | 6233.15 | 6838.235 | 6264.761 | 6266.192 | 6881.876 |
| 156 | 5897.278 | 6893.109 | 6938.592 | 7263.698 | 7068.119 | 6767.4 | 6934.567 | 6346.437 | 7305.754 | 6232.476 | 6838.235 | 6264.761 | 6265.546 | 6881.414 |
| 157 | 5891.158 | 6892.952 | 6938.592 | 7263.698 | 7067.645 | 6767.4 | 6932.066 | 6337.806 | 7305.264 | 6231.937 | 6838.235 | 6263.268 | 6265.153 | 6881.406 |
| 158 | 5885.051 | 6893.109 | 6938.592 | 7263.698 | 7067.476 | 6767.4 | 6930.399 | 6329.199 | 7305.089 | 6231.802 | 6838.235 | 6263.268 | 6265.013 | 6881.406 |
| 159 | 5878.956 | 6892.952 | 6938.592 | 7263.698 | 7067.612 | 6767.4 | 6928.733 | 6320.615 | 7304.88 | 6231.667 | 6838.235 | 6263.268 | 6263.441 | 6881.406 |
| 160 | 5872.874 | 6892.952 | 6938.592 | 7263.698 | 7067.273 | 6767.4 | 6927.068 | 6312.054 | 7304.88 | 6231.667 | 6838.235 | 6263.268 | 6263.441 | 6881.406 |
| 161 | 5866.804 | 6892.952 | 6938.592 | 7263.698 | 7067.273 | 6767.4 | 6925.404 | 6303.517 | 7304.88 | 6231.667 | 6838.235 | 6263.268 | 6263.441 | 6881.406 |
| 162 | 5861.958 | 6892.952 | 6938.592 | 7263.698 | 7067.273 | 6767.4 | 6923.74 | 6295.002 | 7304.88 | 6231.667 | 6838.235 | 6263.268 | 6263.441 | 6881.406 |
| 163 | 5855.911 | 6892.952 | 6938.592 | 7263.698 | 7067.273 | 6767.4 | 6922.077 | 6286.511 | 7304.88 | 6231.667 | 6838.235 | 6263.268 | 6263.441 | 6881.406 |
| 164 | 5851.082 | 6892.952 | 6938.592 | 7263.698 | 7067.273 | 6767.4 | 6920.415 | 6278.042 | 7304.88 | 6231.667 | 6838.235 | 6263.268 | 6263.441 | 6881.406 |
| 165 | 5846.262 | 6892.952 | 6938.592 | 7263.698 | 7067.273 | 6767.4 | 6918.754 | 6269.596 | 7304.88 | 6231.667 | 6838.235 | 6263.268 | 6263.441 | 6881.406 |
| 166 | 5841.449 | 6892.952 | 6938.592 | 7263.698 | 7067.273 | 6767.4 | 6917.094 | 6261.173 | 7304.88 | 6231.667 | 6838.235 | 6263.268 | 6263.441 | 6881.406 |
| 167 | 5836.644 | 6892.952 | 6938.592 | 7263.698 | 7067.273 | 6767.4 | 6915.434 | 6252.773 | 7304.88 | 6231.667 | 6838.235 | 6263.268 | 6263.441 | 6881.406 |
| 168 | 5833.046 | 6892.952 | 6938.592 | 7263.698 | 7067.273 | 6767.4 | 6914.458 | 6244.395 | 7304.88 | 6231.667 | 6838.235 | 6263.268 | 6263.441 | 6881.406 |
| 169 | 5828.255 | 6892.952 | 6938.592 | 7263.698 | 7067.273 | 6767.4 | 6913.775 | 6236.039 | 7304.88 | 6231.667 | 6838.235 | 6263.268 | 6263.441 | 6881.406 |
| 170 | 5824.667 | 6892.952 | 6938.592 | 7263.698 | 7067.273 | 6767.4 | 6912.875 | 6226.319 | 7304.88 | 6231.667 | 6838.235 | 6263.268 | 6263.441 | 6881.406 |
| 171 | 5821.083 | 6892.952 | 6938.592 | 7263.698 | 7067.273 | 6767.4 | 6912.033 | 6218.012 | 7304.88 | 6231.667 | 6838.235 | 6263.268 | 6263.441 | 6881.406 |
| 172 | 5817.504 | 6892.952 | 6938.592 | 7263.698 | 7067.273 | 6767.4 | 6911.192 | 6209.727 | 7304.88 | 6231.667 | 6838.235 | 6263.268 | 6263.441 | 6881.406 |
| 173 | 5813.929 | 6892.952 | 6938.592 | 7263.698 | 7067.273 | 6767.4 | 6910.351 | 6200.089 | 7304.88 | 6231.667 | 6838.235 | 6263.268 | 6263.441 | 6881.406 |
| 174 | 5810.358 | 6892.952 | 6938.592 | 7263.698 | 7067.273 | 6767.4 | 6909.51 | 6191.851 | 7304.88 | 6231.667 | 6838.235 | 6263.268 | 6263.441 | 6881.406 |
| 175 | 5807.98 | 6892.952 | 6938.592 | 7263.698 | 7067.273 | 6767.4 | 6908.669 | 6182.268 | 7304.88 | 6231.667 | 6838.235 | 6263.268 | 6263.441 | 6881.406 |
| 176 | 5804.417 | 6892.952 | 6938.592 | 7263.698 | 7067.273 | 6767.4 | 6907.829 | 6174.078 | 7304.88 | 6231.667 | 6838.235 | 6263.268 | 6263.441 | 6881.406 |
| 177 | 5802.044 | 6892.952 | 6938.592 | 7263.698 | 7067.273 | 6767.4 | 6906.989 | 6164.55 | 7304.88 | 6231.667 | 6838.235 | 6263.268 | 6263.441 | 6881.406 |
| 178 | 5799.673 | 6892.952 | 6938.592 | 7263.698 | 7067.273 | 6767.4 | 6906.148 | 6155.052 | 7304.88 | 6231.667 | 6838.235 | 6263.268 | 6263.441 | 6881.406 |
| 179 | 5797.304 | 6892.952 | 6938.592 | 7263.698 | 7067.273 | 6767.4 | 6905.309 | 6145.582 | 7304.88 | 6231.667 | 6838.235 | 6263.268 | 6263.441 | 6881.406 |
| 180 | 5794.937 | 6892.952 | 6938.592 | 7263.698 | 7067.273 | 6767.4 | 6904.469 | 6137.489 | 7304.88 | 6231.667 | 6838.235 | 6263.268 | 6263.441 | 6881.406 |
| 181 | 5793.754 | 6892.952 | 6938.592 | 7263.698 | 7067.273 | 6767.4 | 6903.63 | 6128.074 | 7304.88 | 6231.667 | 6838.235 | 6263.268 | 6263.441 | 6881.406 |
| 182 | 5791.39 | 6892.952 | 6938.592 | 7263.698 | 7067.273 | 6767.4 | 6902.79 | 6118.687 | 7304.88 | 6231.667 | 6838.235 | 6263.268 | 6263.441 | 6881.406 |
| 183 | 5790.208 | 6892.952 | 6938.592 | 7263.698 | 7067.273 | 6767.4 | 6901.951 | 6109.329 | 7304.88 | 6231.667 | 6838.235 | 6263.268 | 6263.441 | 6881.406 |
| 184 | 5789.027 | 6892.952 | 6938.592 | 7263.698 | 7067.273 | 6767.4 | 6901.112 | 6098.67 | 7304.88 | 6231.667 | 6838.235 | 6263.268 | 6263.441 | 6881.406 |
| 185 | 5787.847 | 6892.952 | 6938.592 | 7263.698 | 7067.273 | 6767.4 | 6900.274 | 6089.373 | 7304.88 | 6231.667 | 6838.235 | 6263.268 | 6263.441 | 6881.406 |
| 186 | 5786.667 | 6892.952 | 6938.592 | 7263.698 | 7067.273 | 6767.4 | 6899.435 | 6080.104 | 7304.88 | 6231.667 | 6838.235 | 6263.268 | 6263.441 | 6881.406 |
| 187 | 5786.667 | 6892.952 | 6938.592 | 7263.698 | 7067.273 | 6767.4 | 6898.597 | 6069.546 | 7304.88 | 6231.667 | 6838.235 | 6263.268 | 6263.441 | 6881.406 |
| 188 | 5785.487 | 6892.952 | 6938.592 | 7263.698 | 7067.273 | 6767.4 | 6897.759 | 6060.338 | 7304.88 | 6231.667 | 6838.235 | 6263.268 | 6263.441 | 6881.406 |
| 189 | 5785.487 | 6892.952 | 6938.592 | 7263.698 | 7067.273 | 6767.4 | 6896.921 | 6049.849 | 7304.88 | 6231.667 | 6838.235 | 6263.268 | 6263.441 | 6881.406 |
| 190 | 5785.487 | 6892.952 | 6938.592 | 7263.698 | 7067.273 | 6767.4 | 6896.084 | 6039.395 | 7304.88 | 6231.667 | 6838.235 | 6263.268 | 6263.441 | 6881.406 |
| 191 | 5785.487 | 6892.952 | 6938.592 | 7263.698 | 7067.273 | 6767.4 | 6895.246 | 6028.978 | 7304.88 | 6231.667 | 6838.235 | 6263.268 | 6263.441 | 6881.406 |
| 192 | 5785.487 | 6892.952 | 6938.592 | 7263.698 | 7067.273 | 6767.4 | 6894.409 | 6018.597 | 7304.88 | 6231.667 | 6838.235 | 6263.268 | 6263.441 | 6881.406 |
| 193 | 5785.487 | 6892.952 | 6938.592 | 7263.698 | 7067.273 | 6767.4 | 6893.572 | 6008.251 | 7304.88 | 6231.667 | 6838.235 | 6263.268 | 6263.441 | 6881.406 |
| 194 | 5785.487 | 6892.952 | 6938.592 | 7263.698 | 7067.273 | 6767.4 | 6892.735 | 5997.941 | 7304.88 | 6231.667 | 6838.235 | 6263.268 | 6263.441 | 6881.406 |
| 195 | 5785.487 | 6892.952 | 6938.592 | 7263.698 | 7067.273 | 6767.4 | 6891.899 | 5987.666 | 7304.88 | 6231.667 | 6838.235 | 6263.268 | 6263.441 | 6881.406 |
| 196 | 5785.487 | 6892.952 | 6938.592 | 7263.698 | 7067.273 | 6767.4 | 6891.062 | 5976.149 | 7304.88 | 6231.667 | 6838.235 | 6263.268 | 6263.441 | 6881.406 |
| 197 | 5785.487 | 6892.952 | 6938.592 | 7263.698 | 7067.273 | 6767.4 | 6890.226 | 5965.948 | 7304.88 | 6231.667 | 6838.235 | 6263.268 | 6263.441 | 6881.406 |
| 198 | 5785.487 | 6892.952 | 6938.592 | 7263.698 | 7067.273 | 6767.4 | 6889.39 | 5954.514 | 7304.88 | 6231.667 | 6838.235 | 6263.268 | 6263.441 | 6881.406 |
| 199 | 5785.487 | 6892.952 | 6938.592 | 7263.698 | 7067.273 | 6767.4 | 6888.554 | 5943.124 | 7304.88 | 6231.667 | 6838.235 | 6263.268 | 6263.441 | 6881.406 |
| 200 | 5785.487 | 6892.952 | 6938.592 | 7263.698 | 7067.273 | 6767.4 | 6887.719 | 5931.778 | 7304.88 | 6231.667 | 6838.235 | 6263.268 | 6263.441 | 6881.406 |
| 201 | 5785.487 | 6892.952 | 6938.592 | 7263.698 | 7067.273 | 6767.4 | 6886.883 | 5920.474 | 7304.88 | 6231.667 | 6838.235 | 6263.268 | 6263.441 | 6881.406 |
| 202 | 5785.487 | 6892.952 | 6938.592 | 7263.698 | 7067.273 | 6767.4 | 6886.048 | 5909.214 | 7304.88 | 6231.667 | 6838.235 | 6263.268 | 6263.441 | 6881.406 |
| 203 | 5785.487 | 6892.952 | 6938.592 | 7263.698 | 7067.273 | 6767.4 | 6885.213 | 5897.996 | 7304.88 | 6231.667 | 6838.235 | 6263.268 | 6263.441 | 6881.406 |
| 204 | 5785.487 | 6892.952 | 6938.592 | 7263.698 | 7067.273 | 6767.4 | 6884.378 | 5885.582 | 7304.88 | 6231.667 | 6838.235 | 6263.268 | 6263.441 | 6881.406 |
| 205 | 5785.487 | 6892.952 | 6938.592 | 7263.698 | 7067.273 | 6767.4 | 6883.544 | 5873.22 | 7304.88 | 6231.667 | 6838.235 | 6263.268 | 6263.441 | 6881.406 |
| 206 | 5785.487 | 6892.952 | 6938.592 | 7263.698 | 7067.273 | 6767.4 | 6882.709 | 5862.138 | 7304.88 | 6231.667 | 6838.235 | 6263.268 | 6263.441 | 6881.406 |
| 207 | 5785.487 | 6892.952 | 6938.592 | 7263.698 | 7067.273 | 6767.4 | 6881.875 | 5849.874 | 7304.88 | 6231.667 | 6838.235 | 6263.268 | 6263.441 | 6881.406 |
| 208 | 5785.487 | 6892.952 | 6938.592 | 7263.698 | 7067.273 | 6767.4 | 6881.041 | 5837.662 | 7304.88 | 6231.667 | 6838.235 | 6263.268 | 6263.441 | 6881.406 |
| 209 | 5785.487 | 6892.952 | 6938.592 | 7263.698 | 7067.273 | 6767.4 | 6880.208 | 5824.287 | 7304.88 | 6231.667 | 6838.235 | 6263.268 | 6263.441 | 6881.406 |
| 210 | 5785.487 | 6892.952 | 6938.592 | 7263.698 | 7067.273 | 6767.4 | 6879.374 | 5812.18 | 7304.88 | 6231.667 | 6838.235 | 6263.268 | 6263.441 | 6881.406 |
| 211 | 5785.487 | 6892.952 | 6938.592 | 7263.698 | 7067.273 | 6767.4 | 6878.541 | 5798.922 | 7304.88 | 6231.667 | 6838.235 | 6263.268 | 6263.441 | 6881.406 |
| 212 | 5785.487 | 6892.952 | 6938.592 | 7263.698 | 7067.273 | 6767.4 | 6877.707 | 5786.921 | 7304.88 | 6231.667 | 6838.235 | 6263.268 | 6263.441 | 6881.406 |
| 213 | 5785.487 | 6892.952 | 6938.592 | 7263.698 | 7067.273 | 6767.4 | 6876.875 | 5773.777 | 7304.88 | 6231.667 | 6838.235 | 6263.268 | 6263.441 | 6881.406 |
| 214 | 5785.487 | 6892.952 | 6938.592 | 7263.698 | 7067.273 | 6767.4 | 6876.042 | 5760.692 | 7304.88 | 6231.667 | 6838.235 | 6263.268 | 6263.441 | 6881.406 |
| 215 | 5785.487 | 6892.952 | 6938.592 | 7263.698 | 7067.273 | 6767.4 | 6875.209 | 5746.486 | 7304.88 | 6231.667 | 6838.235 | 6263.268 | 6263.441 | 6881.406 |
| 216 | 5785.487 | 6892.952 | 6938.592 | 7263.698 | 7067.273 | 6767.4 | 6874.377 | 5733.525 | 7304.88 | 6231.667 | 6838.235 | 6263.268 | 6263.441 | 6881.406 |
| 217 | 5785.487 | 6892.952 | 6938.592 | 7263.698 | 7067.273 | 6767.4 | 6873.545 | 5719.452 | 7304.88 | 6231.667 | 6838.235 | 6263.268 | 6263.441 | 6881.406 |
| 218 | 5785.487 | 6892.952 | 6938.592 | 7263.698 | 7067.273 | 6767.4 | 6872.713 | 5706.612 | 7304.88 | 6231.667 | 6838.235 | 6263.268 | 6263.441 | 6881.406 |
| 219 | 5785.487 | 6892.952 | 6938.592 | 7263.698 | 7067.273 | 6767.4 | 6871.881 | 5692.671 | 7304.88 | 6231.667 | 6838.235 | 6263.268 | 6263.441 | 6881.406 |
| 220 | 5785.487 | 6892.952 | 6938.592 | 7263.698 | 7067.273 | 6767.4 | 6871.049 | 5678.798 | 7304.88 | 6231.667 | 6838.235 | 6263.268 | 6263.441 | 6881.406 |
| 221 | 5785.487 | 6892.952 | 6938.592 | 7263.698 | 7067.273 | 6767.4 | 6870.218 | 5663.844 | 7304.88 | 6231.667 | 6838.235 | 6263.268 | 6263.441 | 6881.406 |
| 222 | 5785.487 | 6892.952 | 6938.592 | 7263.698 | 7067.273 | 6767.4 | 6869.387 | 5650.111 | 7304.88 | 6231.667 | 6838.235 | 6263.268 | 6263.441 | 6881.406 |
| 223 | 5785.487 | 6892.952 | 6938.592 | 7263.698 | 7067.273 | 6767.4 | 6868.556 | 5635.308 | 7304.88 | 6231.667 | 6838.235 | 6263.268 | 6263.441 | 6881.406 |
| 224 | 5785.487 | 6892.952 | 6938.592 | 7263.698 | 7067.273 | 6767.4 | 6867.725 | 5620.583 | 7304.88 | 6231.667 | 6838.235 | 6263.268 | 6263.441 | 6881.406 |
| 225 | 5785.487 | 6892.952 | 6938.592 | 7263.698 | 7067.273 | 6767.4 | 6866.895 | 5605.934 | 7304.88 | 6231.667 | 6838.235 | 6263.268 | 6263.441 | 6881.406 |
| 226 | 5785.487 | 6892.952 | 6938.592 | 7263.698 | 7067.273 | 6767.4 | 6866.064 | 5591.362 | 7304.88 | 6231.667 | 6838.235 | 6263.268 | 6263.441 | 6881.406 |
| 227 | 5785.487 | 6892.952 | 6938.592 | 7263.698 | 7067.273 | 6767.4 | 6865.234 | 5575.753 | 7304.88 | 6231.667 | 6838.235 | 6263.268 | 6263.441 | 6881.406 |
| 228 | 5785.487 | 6892.952 | 6938.592 | 7263.698 | 7067.273 | 6767.4 | 6864.404 | 5560.231 | 7304.88 | 6231.667 | 6838.235 | 6263.268 | 6263.441 | 6881.406 |
| 229 | 5785.487 | 6892.952 | 6938.592 | 7263.698 | 7067.273 | 6767.4 | 6863.575 | 5544.795 | 7304.88 | 6231.667 | 6838.235 | 6263.268 | 6263.441 | 6881.406 |
| 230 | 5785.487 | 6892.952 | 6938.592 | 7263.698 | 7067.273 | 6767.4 | 6862.745 | 5529.444 | 7304.88 | 6231.667 | 6838.235 | 6263.268 | 6263.441 | 6881.406 |
| 231 | 5785.487 | 6892.952 | 6938.592 | 7263.698 | 7067.273 | 6767.4 | 6861.916 | 5514.179 | 7304.88 | 6231.667 | 6838.235 | 6263.268 | 6263.441 | 6881.406 |
| 232 | 5785.487 | 6892.952 | 6938.592 | 7263.698 | 7067.273 | 6767.4 | 6861.087 | 5497.916 | 7304.88 | 6231.667 | 6838.235 | 6263.268 | 6263.441 | 6881.406 |
| 233 | 5785.487 | 6892.952 | 6938.592 | 7263.698 | 7067.273 | 6767.4 | 6860.258 | 5481.749 | 7304.88 | 6231.667 | 6838.235 | 6263.268 | 6263.441 | 6881.406 |
| 234 | 5785.487 | 6892.952 | 6938.592 | 7263.698 | 7067.273 | 6767.4 | 6859.429 | 5465.676 | 7304.88 | 6231.667 | 6838.235 | 6263.268 | 6263.441 | 6881.406 |
| 235 | 5785.487 | 6892.952 | 6938.592 | 7263.698 | 7067.273 | 6767.4 | 6858.6 | 5449.698 | 7304.88 | 6231.667 | 6838.235 | 6263.268 | 6263.441 | 6881.406 |
| 236 | 5785.487 | 6892.952 | 6938.592 | 7263.698 | 7067.273 | 6767.4 | 6857.772 | 5432.757 | 7304.88 | 6231.667 | 6838.235 | 6263.268 | 6263.441 | 6881.406 |
| 237 | 5785.487 | 6892.952 | 6938.592 | 7263.698 | 7067.273 | 6767.4 | 6856.944 | 5416.97 | 7304.88 | 6231.667 | 6838.235 | 6263.268 | 6263.441 | 6881.406 |
| 238 | 5785.487 | 6892.952 | 6938.592 | 7263.698 | 7067.273 | 6767.4 | 6856.116 | 5400.232 | 7304.88 | 6231.667 | 6838.235 | 6263.268 | 6263.441 | 6881.406 |
| 239 | 5785.487 | 6892.952 | 6938.592 | 7263.698 | 7067.273 | 6767.4 | 6855.288 | 5383.596 | 7304.88 | 6231.667 | 6838.235 | 6263.268 | 6263.441 | 6881.406 |
| 240 | 5785.487 | 6892.952 | 6938.592 | 7263.698 | 7067.273 | 6767.4 | 6854.461 | 5366.033 | 7304.88 | 6231.667 | 6838.235 | 6263.268 | 6263.441 | 6881.406 |
| 241 | 5785.487 | 6892.952 | 6938.592 | 7263.698 | 7067.273 | 6767.4 | 6853.633 | 5348.585 | 7304.88 | 6231.667 | 6838.235 | 6263.268 | 6263.441 | 6881.406 |
| 242 | 5785.487 | 6892.952 | 6938.592 | 7263.698 | 7067.273 | 6767.4 | 6852.806 | 5331.249 | 7304.88 | 6231.667 | 6838.235 | 6263.268 | 6263.441 | 6881.406 |
| 243 | 5785.487 | 6892.952 | 6938.592 | 7263.698 | 7067.273 | 6767.4 | 6851.979 | 5314.025 | 7304.88 | 6231.667 | 6838.235 | 6263.268 | 6263.441 | 6881.406 |
| 244 | 5785.487 | 6892.952 | 6938.592 | 7263.698 | 7067.273 | 6767.4 | 6851.153 | 5296.912 | 7304.88 | 6231.667 | 6838.235 | 6263.268 | 6263.441 | 6881.406 |
| 245 | 5785.487 | 6892.952 | 6938.592 | 7263.698 | 7067.273 | 6767.4 | 6850.326 | 5278.913 | 7304.88 | 6231.667 | 6838.235 | 6263.268 | 6263.441 | 6881.406 |
| 246 | 5785.487 | 6892.952 | 6938.592 | 7263.698 | 7067.273 | 6767.4 | 6849.5 | 5261.035 | 7304.88 | 6231.667 | 6838.235 | 6263.268 | 6263.441 | 6881.406 |
| 247 | 5785.487 | 6892.952 | 6938.592 | 7263.698 | 7067.273 | 6767.4 | 6848.674 | 5243.278 | 7304.88 | 6231.667 | 6838.235 | 6263.268 | 6263.441 | 6881.406 |
| 248 | 5785.487 | 6892.952 | 6938.592 | 7263.698 | 7067.273 | 6767.4 | 6847.848 | 5224.664 | 7304.88 | 6231.667 | 6838.235 | 6263.268 | 6263.441 | 6881.406 |
| 249 | 5785.487 | 6892.952 | 6938.592 | 7263.698 | 7067.273 | 6767.4 | 6847.022 | 5206.181 | 7304.88 | 6231.667 | 6838.235 | 6263.268 | 6263.441 | 6881.406 |
| 250 | 5785.487 | 6892.952 | 6938.592 | 7263.698 | 7067.273 | 6767.4 | 6846.196 | 5206.181 | 7304.88 | 6231.667 | 6838.235 | 6263.268 | 6263.441 | 6881.406 |
| 251 | 5785.487 | 6892.952 | 6938.592 | 7263.698 | 7067.273 | 6767.4 | 6845.371 | 5206.181 | 7304.88 | 6231.667 | 6838.235 | 6263.268 | 6263.441 | 6881.406 |
| 252 | 5785.487 | 6892.952 | 6938.592 | 7263.698 | 7067.273 | 6767.4 | 6844.546 | 5206.181 | 7304.88 | 6231.667 | 6838.235 | 6263.268 | 6263.441 | 6881.406 |
| 253 | 5785.487 | 6892.952 | 6938.592 | 7263.698 | 7067.273 | 6767.4 | 6843.721 | 5206.181 | 7304.88 | 6231.667 | 6838.235 | 6263.268 | 6263.441 | 6881.406 |
| 254 | 5785.487 | 6892.952 | 6938.592 | 7263.698 | 7067.273 | 6767.4 | 6842.896 | 5206.181 | 7304.88 | 6231.667 | 6838.235 | 6263.268 | 6263.441 | 6881.406 |
| 255 | 5785.487 | 6892.952 | 6938.592 | 7263.698 | 7067.273 | 6767.4 | 6842.072 | 5206.181 | 7304.88 | 6231.667 | 6838.235 | 6263.268 | 6263.441 | 6881.406 |
| 256 | 5785.487 | 6892.952 | 6938.592 | 7263.698 | 7067.273 | 6767.4 | 6841.247 | 5206.181 | 7304.88 | 6231.667 | 6838.235 | 6263.268 | 6263.441 | 6881.406 |
| 257 | 5785.487 | 6892.952 | 6938.592 | 7263.698 | 7067.273 | 6767.4 | 6840.423 | 5206.181 | 7304.88 | 6231.667 | 6838.235 | 6263.268 | 6263.441 | 6881.406 |
| 258 | 5785.487 | 6892.952 | 6938.592 | 7263.698 | 7067.273 | 6767.4 | 6839.599 | 5206.181 | 7304.88 | 6231.667 | 6838.235 | 6263.268 | 6263.441 | 6881.406 |
| 259 | 5785.487 | 6892.952 | 6938.592 | 7263.698 | 7067.273 | 6767.4 | 6838.775 | 5206.181 | 7304.88 | 6231.667 | 6838.235 | 6263.268 | 6263.441 | 6881.406 |
| 260 | 5785.487 | 6892.952 | 6938.592 | 7263.698 | 7067.273 | 6767.4 | 6837.952 | 5206.181 | 7304.88 | 6231.667 | 6838.235 | 6263.268 | 6263.441 | 6881.406 |
| 261 | 5785.487 | 6892.952 | 6938.592 | 7263.698 | 7067.273 | 6767.4 | 6837.129 | 5206.181 | 7304.88 | 6231.667 | 6838.235 | 6263.268 | 6263.441 | 6881.406 |
| 262 | 5785.487 | 6892.952 | 6938.592 | 7263.698 | 7067.273 | 6767.4 | 6836.305 | 5206.181 | 7304.88 | 6231.667 | 6838.235 | 6263.268 | 6263.441 | 6881.406 |
| 263 | 5785.487 | 6892.952 | 6938.592 | 7263.698 | 7067.273 | 6767.4 | 6835.482 | 5206.181 | 7304.88 | 6231.667 | 6838.235 | 6263.268 | 6263.441 | 6881.406 |
| 264 | 5785.487 | 6892.952 | 6938.592 | 7263.698 | 7067.273 | 6767.4 | 6834.66 | 5206.181 | 7304.88 | 6231.667 | 6838.235 | 6263.268 | 6263.441 | 6881.406 |
| 265 | 5785.487 | 6892.952 | 6938.592 | 7263.698 | 7067.273 | 6767.4 | 6833.837 | 5206.181 | 7304.88 | 6231.667 | 6838.235 | 6263.268 | 6263.441 | 6881.406 |
| 266 | 5785.487 | 6892.952 | 6938.592 | 7263.698 | 7067.273 | 6767.4 | 6833.015 | 5206.181 | 7304.88 | 6231.667 | 6838.235 | 6263.268 | 6263.441 | 6881.406 |
| 267 | 5785.487 | 6892.952 | 6938.592 | 7263.698 | 7067.273 | 6767.4 | 6832.193 | 5206.181 | 7304.88 | 6231.667 | 6838.235 | 6263.268 | 6263.441 | 6881.406 |
| 268 | 5785.487 | 6892.952 | 6938.592 | 7263.698 | 7067.273 | 6767.4 | 6831.371 | 5206.181 | 7304.88 | 6231.667 | 6838.235 | 6263.268 | 6263.441 | 6881.406 |
| 269 | 5785.487 | 6892.952 | 6938.592 | 7263.698 | 7067.273 | 6767.4 | 6830.549 | 5206.181 | 7304.88 | 6231.667 | 6838.235 | 6263.268 | 6263.441 | 6881.406 |
| 270 | 5785.487 | 6892.952 | 6938.592 | 7263.698 | 7067.273 | 6767.4 | 6829.727 | 5206.181 | 7304.88 | 6231.667 | 6838.235 | 6263.268 | 6263.441 | 6881.406 |
| 271 | 5785.487 | 6892.952 | 6938.592 | 7263.698 | 7067.273 | 6767.4 | 6828.906 | 5206.181 | 7304.88 | 6231.667 | 6838.235 | 6263.268 | 6263.441 | 6881.406 |
| 272 | 5785.487 | 6892.952 | 6938.592 | 7263.698 | 7067.273 | 6767.4 | 6828.085 | 5206.181 | 7304.88 | 6231.667 | 6838.235 | 6263.268 | 6263.441 | 6881.406 |
| 273 | 5785.487 | 6892.952 | 6938.592 | 7263.698 | 7067.273 | 6767.4 | 6827.264 | 5206.181 | 7304.88 | 6231.667 | 6838.235 | 6263.268 | 6263.441 | 6881.406 |
| 274 | 5785.487 | 6892.952 | 6938.592 | 7263.698 | 7067.273 | 6767.4 | 6826.443 | 5206.181 | 7304.88 | 6231.667 | 6838.235 | 6263.268 | 6263.441 | 6881.406 |
| 275 | 5785.487 | 6892.952 | 6938.592 | 7263.698 | 7067.273 | 6767.4 | 6825.622 | 5206.181 | 7304.88 | 6231.667 | 6838.235 | 6263.268 | 6263.441 | 6881.406 |
| 276 | 5785.487 | 6892.952 | 6938.592 | 7263.698 | 7067.273 | 6767.4 | 6824.802 | 5206.181 | 7304.88 | 6231.667 | 6838.235 | 6263.268 | 6263.441 | 6881.406 |
| 277 | 5785.487 | 6892.952 | 6938.592 | 7263.698 | 7067.273 | 6767.4 | 6823.982 | 5206.181 | 7304.88 | 6231.667 | 6838.235 | 6263.268 | 6263.441 | 6881.406 |
| 278 | 5785.487 | 6892.952 | 6938.592 | 7263.698 | 7067.273 | 6767.4 | 6823.162 | 5206.181 | 7304.88 | 6231.667 | 6838.235 | 6263.268 | 6263.441 | 6881.406 |
| 279 | 5785.487 | 6892.952 | 6938.592 | 7263.698 | 7067.273 | 6767.4 | 6822.342 | 5206.181 | 7304.88 | 6231.667 | 6838.235 | 6263.268 | 6263.441 | 6881.406 |
| 280 | 5785.487 | 6892.952 | 6938.592 | 7263.698 | 7067.273 | 6767.4 | 6821.522 | 5206.181 | 7304.88 | 6231.667 | 6838.235 | 6263.268 | 6263.441 | 6881.406 |
| 281 | 5785.487 | 6892.952 | 6938.592 | 7263.698 | 7067.273 | 6767.4 | 6820.703 | 5206.181 | 7304.88 | 6231.667 | 6838.235 | 6263.268 | 6263.441 | 6881.406 |
| 282 | 5785.487 | 6892.952 | 6938.592 | 7263.698 | 7067.273 | 6767.4 | 6819.884 | 5206.181 | 7304.88 | 6231.667 | 6838.235 | 6263.268 | 6263.441 | 6881.406 |
| 283 | 5785.487 | 6892.952 | 6938.592 | 7263.698 | 7067.273 | 6767.4 | 6819.065 | 5206.181 | 7304.88 | 6231.667 | 6838.235 | 6263.268 | 6263.441 | 6881.406 |
| 284 | 5785.487 | 6892.952 | 6938.592 | 7263.698 | 7067.273 | 6767.4 | 6818.246 | 5206.181 | 7304.88 | 6231.667 | 6838.235 | 6263.268 | 6263.441 | 6881.406 |
| 285 | 5785.487 | 6892.952 | 6938.592 | 7263.698 | 7067.273 | 6767.4 | 6817.427 | 5206.181 | 7304.88 | 6231.667 | 6838.235 | 6263.268 | 6263.441 | 6881.406 |
| 286 | 5785.487 | 6892.952 | 6938.592 | 7263.698 | 7067.273 | 6767.4 | 6816.609 | 5206.181 | 7304.88 | 6231.667 | 6838.235 | 6263.268 | 6263.441 | 6881.406 |
| 287 | 5785.487 | 6892.952 | 6938.592 | 7263.698 | 7067.273 | 6767.4 | 6815.791 | 5206.181 | 7304.88 | 6231.667 | 6838.235 | 6263.268 | 6263.441 | 6881.406 |
| 288 | 5785.487 | 6892.952 | 6938.592 | 7263.698 | 7067.273 | 6767.4 | 6814.973 | 5206.181 | 7304.88 | 6231.667 | 6838.235 | 6263.268 | 6263.441 | 6881.406 |
| 289 | 5785.487 | 6892.952 | 6938.592 | 7263.698 | 7067.273 | 6767.4 | 6814.155 | 5206.181 | 7304.88 | 6231.667 | 6838.235 | 6263.268 | 6263.441 | 6881.406 |
| 290 | 5785.487 | 6892.952 | 6938.592 | 7263.698 | 7067.273 | 6767.4 | 6813.337 | 5206.181 | 7304.88 | 6231.667 | 6838.235 | 6263.268 | 6263.441 | 6881.406 |
| 291 | 5785.487 | 6892.952 | 6938.592 | 7263.698 | 7067.273 | 6767.4 | 6812.52 | 5206.181 | 7304.88 | 6231.667 | 6838.235 | 6263.268 | 6263.441 | 6881.406 |
| 292 | 5785.487 | 6892.952 | 6938.592 | 7263.698 | 7067.273 | 6767.4 | 6811.703 | 5206.181 | 7304.88 | 6231.667 | 6838.235 | 6263.268 | 6263.441 | 6881.406 |
| 293 | 5785.487 | 6892.952 | 6938.592 | 7263.698 | 7067.273 | 6767.4 | 6810.886 | 5206.181 | 7304.88 | 6231.667 | 6838.235 | 6263.268 | 6263.441 | 6881.406 |
| 294 | 5785.487 | 6892.952 | 6938.592 | 7263.698 | 7067.273 | 6767.4 | 6810.069 | 5206.181 | 7304.88 | 6231.667 | 6838.235 | 6263.268 | 6263.441 | 6881.406 |
| 295 | 5785.487 | 6892.952 | 6938.592 | 7263.698 | 7067.273 | 6767.4 | 6809.252 | 5206.181 | 7304.88 | 6231.667 | 6838.235 | 6263.268 | 6263.441 | 6881.406 |
| 296 | 5785.487 | 6892.952 | 6938.592 | 7263.698 | 7067.273 | 6767.4 | 6808.436 | 5206.181 | 7304.88 | 6231.667 | 6838.235 | 6263.268 | 6263.441 | 6881.406 |
| 297 | 5785.487 | 6892.952 | 6938.592 | 7263.698 | 7067.273 | 6767.4 | 6807.619 | 5206.181 | 7304.88 | 6231.667 | 6838.235 | 6263.268 | 6263.441 | 6881.406 |
| 298 | 5785.487 | 6892.952 | 6938.592 | 7263.698 | 7067.273 | 6767.4 | 6806.803 | 5206.181 | 7304.88 | 6231.667 | 6838.235 | 6263.268 | 6263.441 | 6881.406 |
| 299 | 5785.487 | 6892.952 | 6938.592 | 7263.698 | 7067.273 | 6767.4 | 6805.987 | 5206.181 | 7304.88 | 6231.667 | 6838.235 | 6263.268 | 6263.441 | 6881.406 |